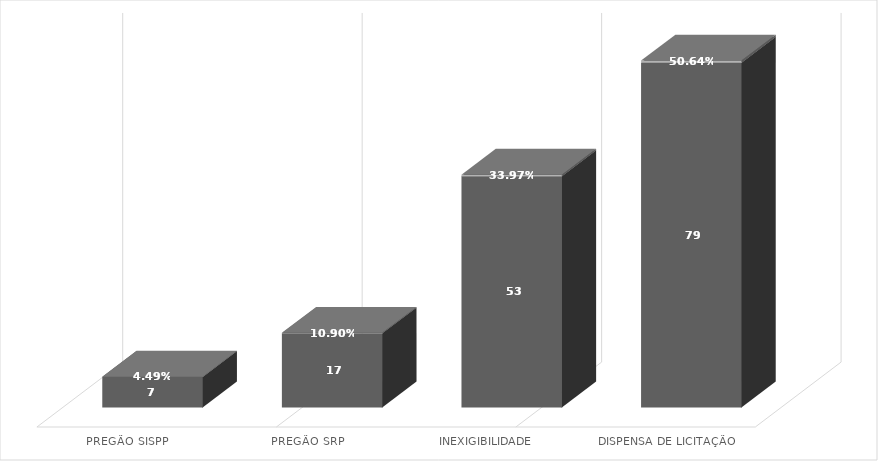
| Category | Contagem de Processo nº | Contagem de Processo nº2 |
|---|---|---|
| PREGÃO SISPP | 7 | 0.045 |
| PREGÃO SRP | 17 | 0.109 |
| INEXIGIBILIDADE | 53 | 0.34 |
| DISPENSA DE LICITAÇÃO | 79 | 0.506 |